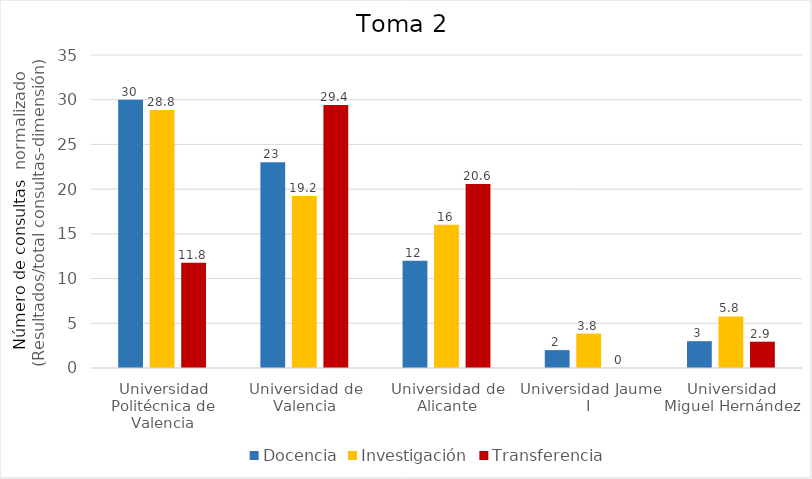
| Category | Docencia | Investigación | Transferencia |
|---|---|---|---|
| Universidad Politécnica de Valencia | 30 | 28.846 | 11.765 |
| Universidad de Valencia | 23 | 19.231 | 29.412 |
| Universidad de Alicante | 12 | 16.026 | 20.588 |
| Universidad Jaume I | 2 | 3.846 | 0 |
| Universidad Miguel Hernández | 3 | 5.769 | 2.941 |